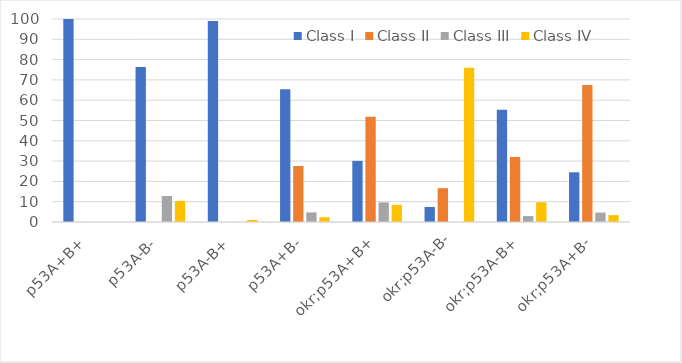
| Category | Class I | Class II | Class III | Class IV |
|---|---|---|---|---|
| p53A+B+ | 100 | 0 | 0 | 0 |
| p53A-B- | 76.4 | 0 | 12.8 | 10.4 |
| p53A-B+ | 99 | 0 | 0 | 1 |
| p53A+B- | 65.354 | 27.559 | 4.724 | 2.362 |
| okr;p53A+B+ | 30.12 | 51.807 | 9.639 | 8.434 |
| okr;p53A-B- | 7.407 | 16.667 | 0 | 75.926 |
| okr;p53A-B+ | 55.34 | 32.039 | 2.913 | 9.709 |
| okr;p53A+B- | 24.473 | 67.511 | 4.641 | 3.376 |